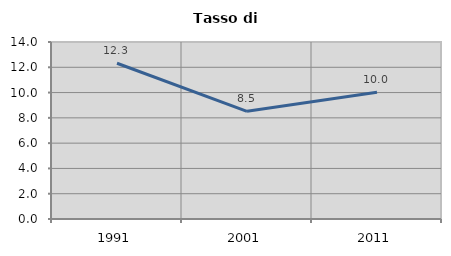
| Category | Tasso di disoccupazione   |
|---|---|
| 1991.0 | 12.317 |
| 2001.0 | 8.516 |
| 2011.0 | 10.023 |